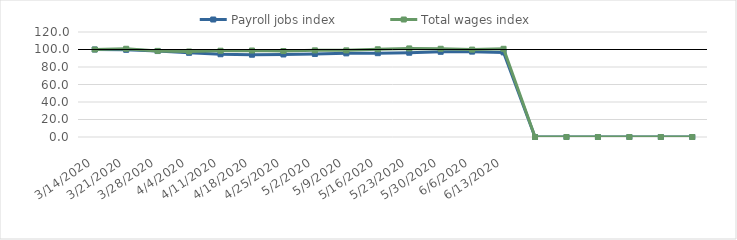
| Category | Payroll jobs index | Total wages index |
|---|---|---|
| 14/03/2020 | 100 | 100 |
| 21/03/2020 | 99.63 | 100.832 |
| 28/03/2020 | 98.232 | 98.402 |
| 04/04/2020 | 96.207 | 97.719 |
| 11/04/2020 | 94.572 | 98.604 |
| 18/04/2020 | 94.02 | 98.856 |
| 25/04/2020 | 94.311 | 98.264 |
| 02/05/2020 | 94.898 | 99.027 |
| 09/05/2020 | 95.578 | 99.015 |
| 16/05/2020 | 95.796 | 100.249 |
| 23/05/2020 | 96.305 | 101.223 |
| 30/05/2020 | 97.361 | 100.829 |
| 06/06/2020 | 97.555 | 99.864 |
| 13/06/2020 | 96.687 | 100.794 |